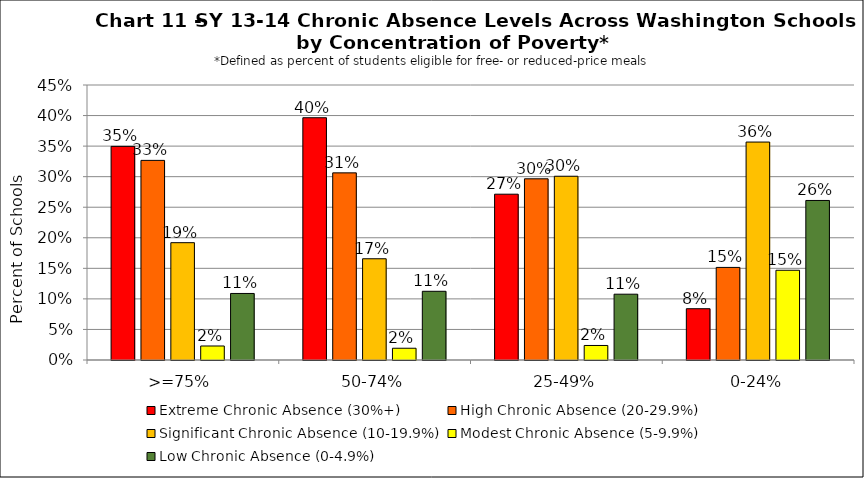
| Category | Extreme Chronic Absence (30%+) | High Chronic Absence (20-29.9%) | Significant Chronic Absence (10-19.9%) | Modest Chronic Absence (5-9.9%) | Low Chronic Absence (0-4.9%) |
|---|---|---|---|---|---|
| 0 | 0.35 | 0.327 | 0.192 | 0.023 | 0.109 |
| 1 | 0.396 | 0.306 | 0.166 | 0.019 | 0.112 |
| 2 | 0.271 | 0.297 | 0.301 | 0.024 | 0.108 |
| 3 | 0.084 | 0.152 | 0.357 | 0.147 | 0.261 |